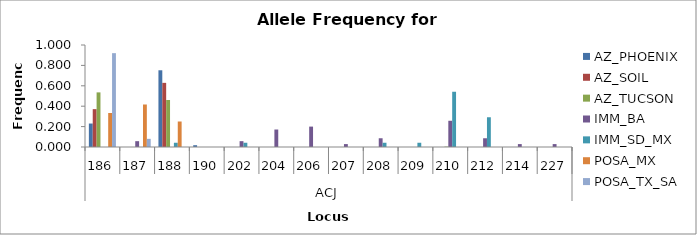
| Category | AZ_PHOENIX | AZ_SOIL | AZ_TUCSON | IMM_BA | IMM_SD_MX | POSA_MX | POSA_TX_SA |
|---|---|---|---|---|---|---|---|
| 0 | 0.23 | 0.371 | 0.535 | 0 | 0 | 0.333 | 0.92 |
| 1 | 0 | 0 | 0 | 0.057 | 0 | 0.417 | 0.08 |
| 2 | 0.752 | 0.629 | 0.461 | 0 | 0.042 | 0.25 | 0 |
| 3 | 0.018 | 0 | 0 | 0 | 0 | 0 | 0 |
| 4 | 0 | 0 | 0 | 0.057 | 0.042 | 0 | 0 |
| 5 | 0 | 0 | 0 | 0.171 | 0 | 0 | 0 |
| 6 | 0 | 0 | 0 | 0.2 | 0 | 0 | 0 |
| 7 | 0 | 0 | 0 | 0.029 | 0 | 0 | 0 |
| 8 | 0 | 0 | 0 | 0.086 | 0.042 | 0 | 0 |
| 9 | 0 | 0 | 0 | 0 | 0.042 | 0 | 0 |
| 10 | 0 | 0 | 0.004 | 0.257 | 0.542 | 0 | 0 |
| 11 | 0 | 0 | 0 | 0.086 | 0.292 | 0 | 0 |
| 12 | 0 | 0 | 0 | 0.029 | 0 | 0 | 0 |
| 13 | 0 | 0 | 0 | 0.029 | 0 | 0 | 0 |